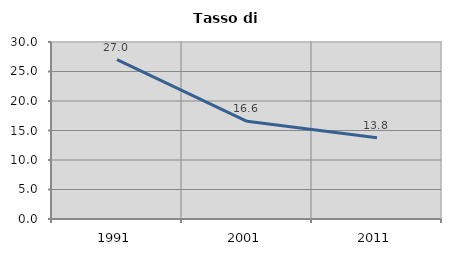
| Category | Tasso di disoccupazione   |
|---|---|
| 1991.0 | 27.02 |
| 2001.0 | 16.556 |
| 2011.0 | 13.778 |